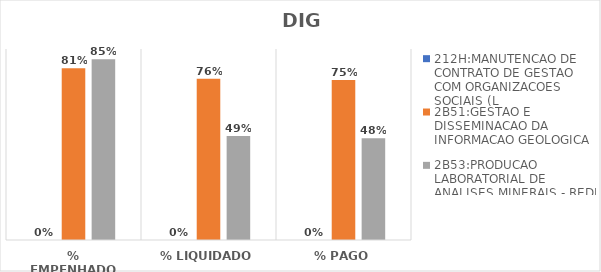
| Category | 212H:MANUTENCAO DE CONTRATO DE GESTAO COM ORGANIZACOES SOCIAIS (L | 2B51:GESTAO E DISSEMINACAO DA INFORMACAO GEOLOGICA | 2B53:PRODUCAO LABORATORIAL DE ANALISES MINERAIS - REDE LAMIN |
|---|---|---|---|
| % EMPENHADO | 0 | 0.809 | 0.851 |
| % LIQUIDADO | 0 | 0.76 | 0.49 |
| % PAGO | 0 | 0.754 | 0.48 |